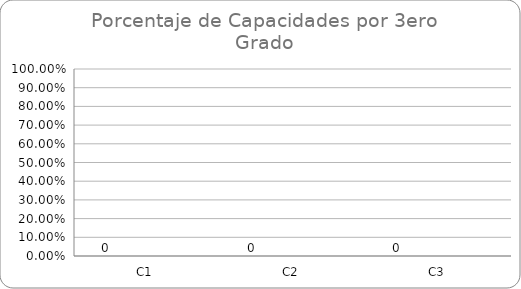
| Category | Series 0 | Series 1 | Series 2 | Series 3 |
|---|---|---|---|---|
| C1 |  |  |  | 0 |
| C2 |  |  |  | 0 |
| C3 |  |  |  | 0 |